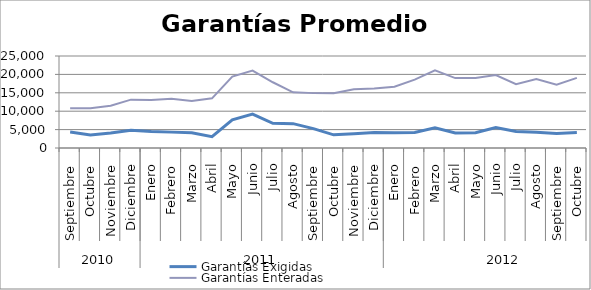
| Category | Garantías Exigidas | Garantías Enteradas |
|---|---|---|
| 0 | 4372.607 | 10829.062 |
| 1 | 3557.93 | 10787.9 |
| 2 | 4056.528 | 11463.422 |
| 3 | 4832.111 | 13142.881 |
| 4 | 4466.32 | 13061.162 |
| 5 | 4313.718 | 13357.444 |
| 6 | 4162.491 | 12796.251 |
| 7 | 3090.395 | 13495.263 |
| 8 | 7655.186 | 19416.342 |
| 9 | 9198.096 | 21035.301 |
| 10 | 6699.851 | 17866.843 |
| 11 | 6615.292 | 15119.839 |
| 12 | 5266.973 | 14911.639 |
| 13 | 3572.137 | 14861.465 |
| 14 | 3876.388 | 15976.819 |
| 15 | 4182.413 | 16147.351 |
| 16 | 4146.8 | 16662.483 |
| 17 | 4190.531 | 18572.749 |
| 18 | 5482.211 | 21128.648 |
| 19 | 4079.038 | 18997.51 |
| 20 | 4141.554 | 19005.364 |
| 21 | 5549.139 | 19818.91 |
| 22 | 4487.023 | 17351.39 |
| 23 | 4277.924 | 18719.955 |
| 24 | 3940.893 | 17217.403 |
| 25 | 4180.69 | 19046.939 |